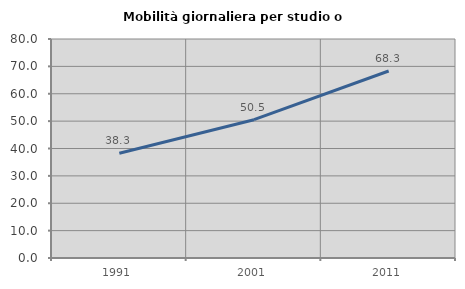
| Category | Mobilità giornaliera per studio o lavoro |
|---|---|
| 1991.0 | 38.274 |
| 2001.0 | 50.525 |
| 2011.0 | 68.323 |